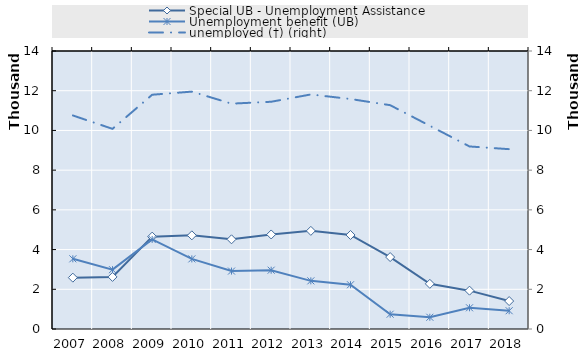
| Category | 0 | Series 14 | Series 15 | Series 16 | Series 17 | Series 18 | Series 19 | Special UB - Unemployment Assistance | Unemployment benefit (UB) |
|---|---|---|---|---|---|---|---|---|---|
| 2007.0 |  |  |  |  |  |  |  | 2585.75 | 3534 |
| 2008.0 |  |  |  |  |  |  |  | 2623.25 | 2988 |
| 2009.0 |  |  |  |  |  |  |  | 4651.75 | 4511 |
| 2010.0 |  |  |  |  |  |  |  | 4715.75 | 3530 |
| 2011.0 |  |  |  |  |  |  |  | 4517 | 2917 |
| 2012.0 |  |  |  |  |  |  |  | 4761 | 2961 |
| 2013.0 |  |  |  |  |  |  |  | 4942 | 2425 |
| 2014.0 |  |  |  |  |  |  |  | 4735 | 2228 |
| 2015.0 |  |  |  |  |  |  |  | 3622.5 | 745.5 |
| 2016.0 |  |  |  |  |  |  |  | 2274.25 | 591 |
| 2017.0 |  |  |  |  |  |  |  | 1931 | 1068 |
| 2018.0 |  |  |  |  |  |  |  | 1407 | 920 |